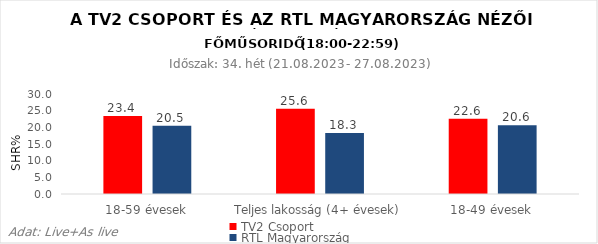
| Category | TV2 Csoport | RTL Magyarország |
|---|---|---|
| 18-59 évesek | 23.4 | 20.5 |
| Teljes lakosság (4+ évesek) | 25.6 | 18.3 |
| 18-49 évesek | 22.6 | 20.6 |